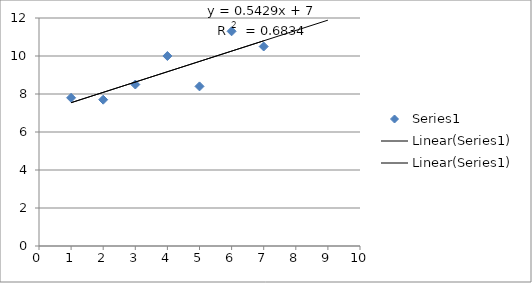
| Category | Series 0 |
|---|---|
| 1.0 | 7.8 |
| 2.0 | 7.7 |
| 3.0 | 8.5 |
| 4.0 | 10 |
| 5.0 | 8.4 |
| 6.0 | 11.3 |
| 7.0 | 10.5 |